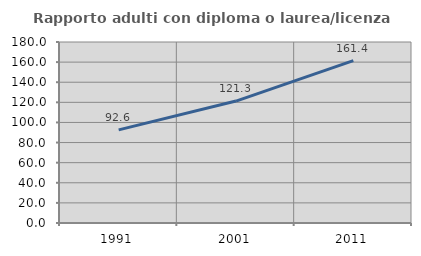
| Category | Rapporto adulti con diploma o laurea/licenza media  |
|---|---|
| 1991.0 | 92.624 |
| 2001.0 | 121.271 |
| 2011.0 | 161.43 |